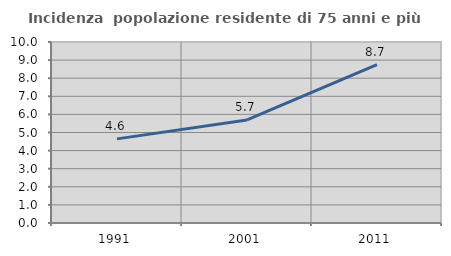
| Category | Incidenza  popolazione residente di 75 anni e più |
|---|---|
| 1991.0 | 4.649 |
| 2001.0 | 5.694 |
| 2011.0 | 8.746 |